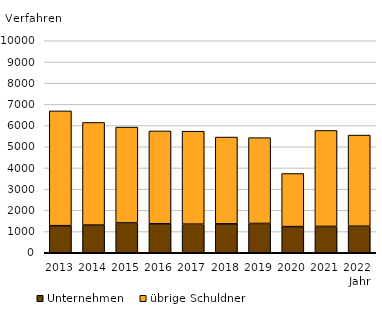
| Category | Unternehmen  | übrige Schuldner |
|---|---|---|
| 2013.0 | 1278 | 5413 |
| 2014.0 | 1305 | 4842 |
| 2015.0 | 1407 | 4521 |
| 2016.0 | 1369 | 4377 |
| 2017.0 | 1349 | 4385 |
| 2018.0 | 1364 | 4093 |
| 2019.0 | 1382 | 4047 |
| 2020.0 | 1233 | 2505 |
| 2021.0 | 1242 | 4527 |
| 2022.0 | 1252 | 4299 |